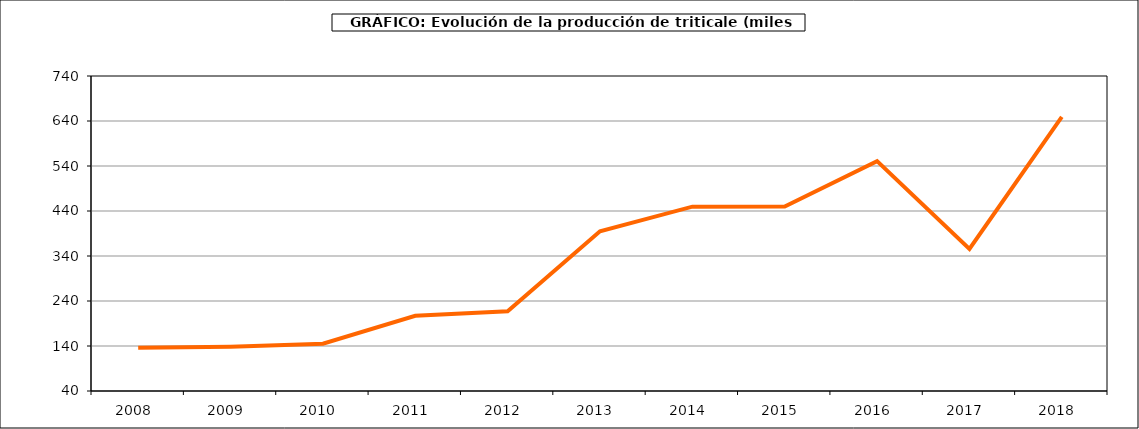
| Category | Producción |
|---|---|
| 2008.0 | 136.246 |
| 2009.0 | 138.491 |
| 2010.0 | 144.991 |
| 2011.0 | 207.218 |
| 2012.0 | 217.311 |
| 2013.0 | 394.752 |
| 2014.0 | 449.675 |
| 2015.0 | 449.983 |
| 2016.0 | 550.838 |
| 2017.0 | 355.84 |
| 2018.0 | 649.011 |